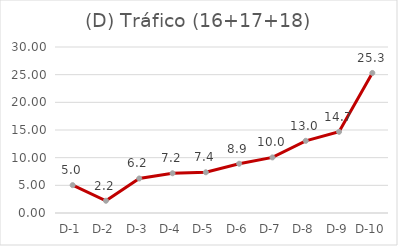
| Category | TRAF(16+17) |
|---|---|
| D-1 | 5.035 |
| D-2 | 2.216 |
| D-3 | 6.236 |
| D-4 | 7.181 |
| D-5 | 7.359 |
| D-6 | 8.901 |
| D-7 | 10.047 |
| D-8 | 13.045 |
| D-9 | 14.672 |
| D-10 | 25.308 |